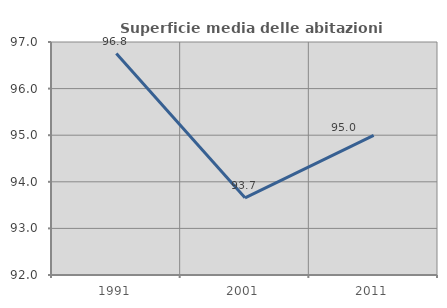
| Category | Superficie media delle abitazioni occupate |
|---|---|
| 1991.0 | 96.751 |
| 2001.0 | 93.657 |
| 2011.0 | 94.995 |